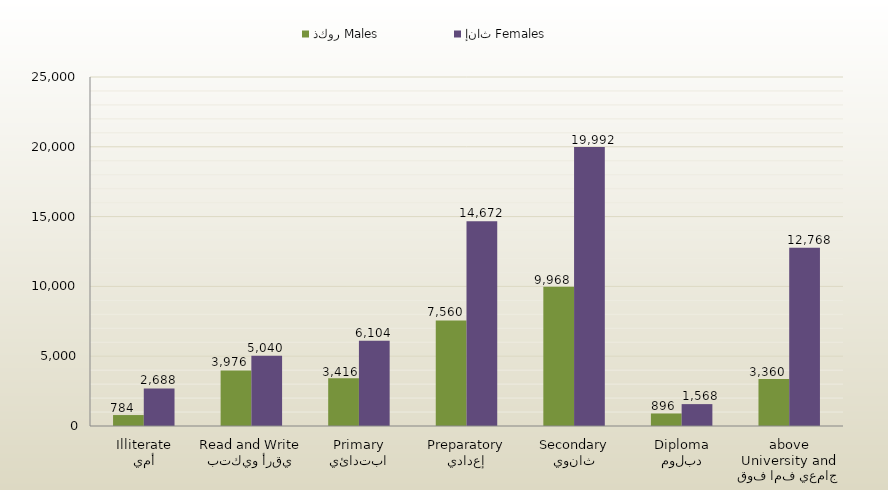
| Category | ذكور Males | إناث Females |
|---|---|---|
| أمي
Illiterate | 784 | 2688 |
| يقرأ ويكتب
Read and Write | 3976 | 5040 |
| ابتدائي
Primary | 3416 | 6104 |
| إعدادي
Preparatory | 7560 | 14672 |
| ثانوي
Secondary | 9968 | 19992 |
| دبلوم
Diploma | 896 | 1568 |
| جامعي فما فوق
University and above | 3360 | 12768 |